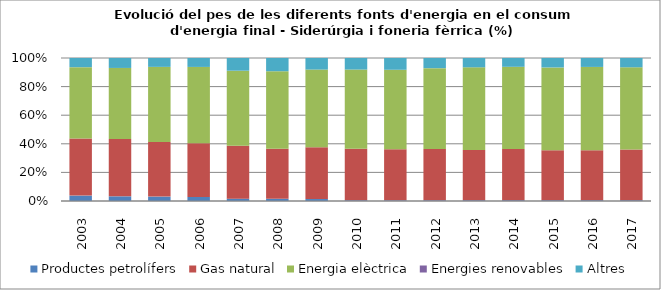
| Category | Productes petrolífers | Gas natural | Energia elèctrica | Energies renovables | Altres |
|---|---|---|---|---|---|
| 2003.0 | 7.2 | 76 | 94.9 | 0 | 12.2 |
| 2004.0 | 6.4 | 78.2 | 97.3 | 0 | 13.6 |
| 2005.0 | 7.9 | 97.7 | 134.4 | 0 | 15.9 |
| 2006.0 | 7.6 | 100.8 | 143.8 | 0 | 16.8 |
| 2007.0 | 4.5 | 102.3 | 144.5 | 0 | 24.5 |
| 2008.0 | 4.1 | 92.6 | 143 | 0 | 24.4 |
| 2009.0 | 3.2 | 84.3 | 126.3 | 0 | 18.8 |
| 2010.0 | 1.2 | 81.7 | 125.4 | 0 | 18.3 |
| 2011.0 | 1 | 80.3 | 125 | 0 | 18.5 |
| 2012.0 | 1 | 74.2 | 117.3 | 0 | 14.7 |
| 2013.0 | 1.1 | 71.9 | 118.2 | 0 | 13.3 |
| 2014.0 | 1.2 | 72 | 116 | 0 | 12.4 |
| 2015.0 | 1.2 | 72.9 | 120.9 | 0 | 13.8 |
| 2016.0 | 1.2 | 71.6 | 119.4 | 0 | 12.8 |
| 2017.0 | 1.2 | 73.1 | 118.9 | 0 | 13.4 |